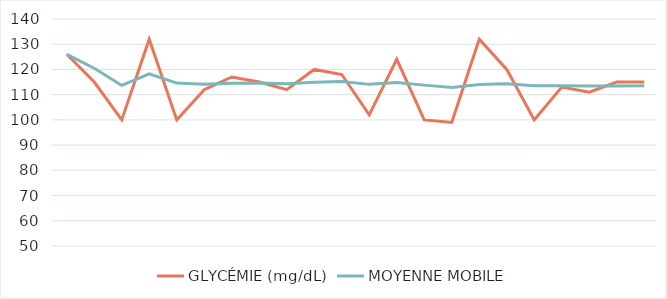
| Category | GLYCÉMIE (mg/dL) | MOYENNE MOBILE |
|---|---|---|
| 0 | 126 | 126 |
| 1 | 115 | 120.5 |
| 2 | 100 | 113.667 |
| 3 | 132 | 118.25 |
| 4 | 100 | 114.6 |
| 5 | 112 | 114.167 |
| 6 | 117 | 114.571 |
| 7 | 115 | 114.625 |
| 8 | 112 | 114.333 |
| 9 | 120 | 114.9 |
| 10 | 118 | 115.182 |
| 11 | 102 | 114.083 |
| 12 | 124 | 114.846 |
| 13 | 100 | 113.786 |
| 14 | 99 | 112.8 |
| 15 | 132 | 114 |
| 16 | 120 | 114.353 |
| 17 | 100 | 113.556 |
| 18 | 113 | 113.526 |
| 19 | 111 | 113.4 |
| 20 | 115 | 113.476 |
| 21 | 115 | 113.545 |